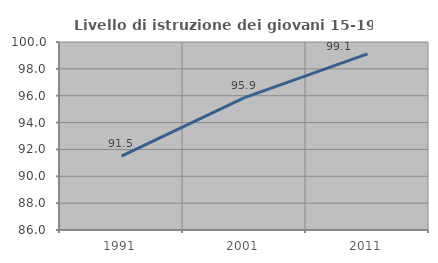
| Category | Livello di istruzione dei giovani 15-19 anni |
|---|---|
| 1991.0 | 91.494 |
| 2001.0 | 95.853 |
| 2011.0 | 99.11 |